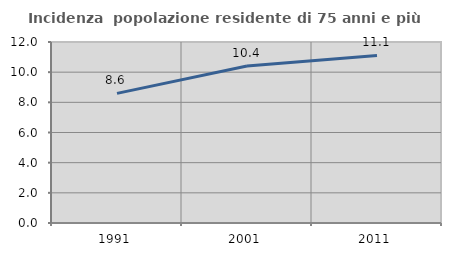
| Category | Incidenza  popolazione residente di 75 anni e più |
|---|---|
| 1991.0 | 8.595 |
| 2001.0 | 10.403 |
| 2011.0 | 11.109 |